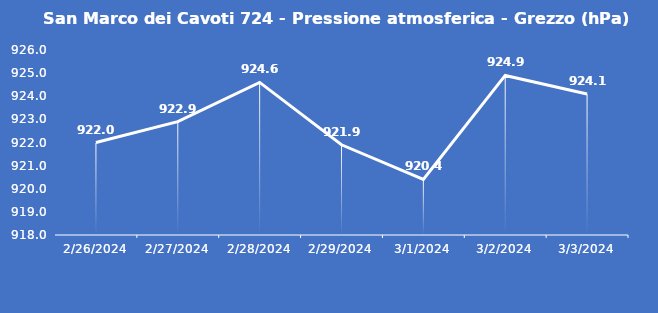
| Category | San Marco dei Cavoti 724 - Pressione atmosferica - Grezzo (hPa) |
|---|---|
| 2/26/24 | 922 |
| 2/27/24 | 922.9 |
| 2/28/24 | 924.6 |
| 2/29/24 | 921.9 |
| 3/1/24 | 920.4 |
| 3/2/24 | 924.9 |
| 3/3/24 | 924.1 |